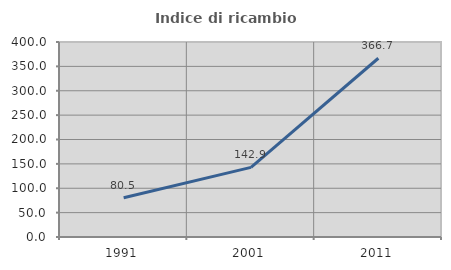
| Category | Indice di ricambio occupazionale  |
|---|---|
| 1991.0 | 80.531 |
| 2001.0 | 142.857 |
| 2011.0 | 366.667 |